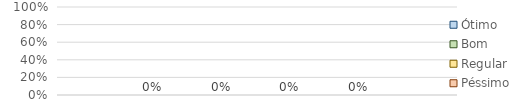
| Category | Ótimo | Bom | Regular | Péssimo |
|---|---|---|---|---|
|  | 0 | 0 | 0 | 0 |